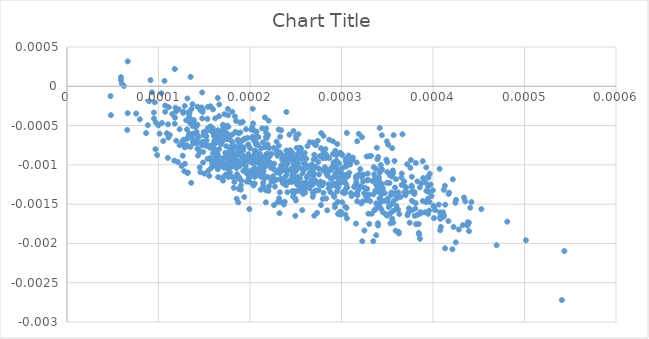
| Category | Series 0 |
|---|---|
| 0.0002059334187757444 | -0.001 |
| 0.00017873950510452084 | -0.001 |
| 0.00038637303945561073 | -0.002 |
| 0.00022622890162013421 | -0.001 |
| 0.0002802560820361803 | -0.001 |
| 0.000198221731616687 | -0.001 |
| 0.0001949640746769581 | -0.001 |
| 0.0003286916102136511 | -0.001 |
| 0.0002985173471838856 | -0.001 |
| 0.0002181282982446233 | -0.001 |
| 0.00018853605518445236 | -0.001 |
| 0.00013614094571099528 | 0 |
| 0.00037973577228441553 | -0.001 |
| 0.00021832474555342267 | -0.001 |
| 0.00021808519748877893 | -0.001 |
| 0.00011782064754439687 | 0 |
| 0.00023542629021997263 | -0.001 |
| 0.00025458799556315825 | -0.001 |
| 9.667395384877579e-05 | -0.001 |
| 0.00031384824350687247 | -0.001 |
| 0.00022511652023571467 | -0.001 |
| 0.00014784454089484923 | -0.001 |
| 0.00029160960077997576 | -0.001 |
| 0.0003720149775167321 | -0.002 |
| 0.00017050756453361517 | 0 |
| 0.00014197136867453284 | -0.001 |
| 0.00016473269119548283 | -0.001 |
| 0.0001052305302103412 | -0.001 |
| 0.0002165882952276627 | -0.001 |
| 0.0002480288001324983 | -0.001 |
| 0.0002398601924504976 | -0.001 |
| 0.00038100035432189695 | -0.001 |
| 0.00013170922230633006 | -0.001 |
| 0.0002932567793928267 | -0.001 |
| 0.00020011428085183844 | -0.001 |
| 0.0002955400213553198 | -0.001 |
| 0.0002504448273408483 | -0.001 |
| 0.00027100320498427675 | -0.001 |
| 0.00039118160850282305 | -0.002 |
| 0.00023614666263451308 | -0.001 |
| 0.00020298063540408244 | 0 |
| 0.00018625745836235854 | -0.001 |
| 0.00035334749468956845 | -0.001 |
| 0.0003928138116213717 | -0.001 |
| 0.00035616765817089664 | -0.001 |
| 9.854872788621157e-05 | -0.001 |
| 0.0002964021250078825 | -0.001 |
| 0.0001477752714875678 | 0 |
| 0.00018586541294297122 | -0.001 |
| 0.0002447611121179773 | -0.001 |
| 0.00022516565482999659 | -0.001 |
| 0.0002588774201122195 | -0.001 |
| 0.00014253200676217967 | 0 |
| 0.00029508170008718006 | -0.001 |
| 0.00021750039707035742 | -0.001 |
| 0.00018360339577949166 | 0 |
| 0.00027202451017920633 | -0.001 |
| 0.00029301994513887444 | -0.002 |
| 0.00018896731118193087 | -0.001 |
| 0.00039189237850564655 | -0.001 |
| 0.0004078451833932507 | -0.002 |
| 0.00035003082546638045 | -0.001 |
| 0.00037687706338994376 | -0.001 |
| 0.00025003936996281664 | -0.001 |
| 0.00019728793817289057 | -0.001 |
| 0.0003352799090532118 | -0.001 |
| 0.0003250335888972819 | -0.002 |
| 0.00030410678075982296 | -0.001 |
| 0.00030445416758229527 | -0.001 |
| 0.00019575285352221847 | -0.001 |
| 0.00025705497244608784 | -0.002 |
| 0.0002899611489096534 | -0.001 |
| 0.00030698811108736225 | -0.001 |
| 0.00014159483662930873 | -0.001 |
| 0.00041126661857923154 | -0.002 |
| 0.000317150060955305 | -0.001 |
| 0.00012531447346106618 | -0.001 |
| 0.00024626842266694334 | -0.001 |
| 0.0002262204638564449 | -0.002 |
| 0.00032738729283113597 | -0.001 |
| 0.00031685818463767597 | -0.001 |
| 0.00018379707366638105 | -0.001 |
| 0.0003769580965676348 | -0.001 |
| 0.00031116378342804964 | -0.001 |
| 0.00013434997356962598 | 0 |
| 0.00016206729997483016 | -0.001 |
| 0.00013720061210421093 | -0.001 |
| 0.00019959738907936468 | -0.001 |
| 0.0003055164096542755 | -0.001 |
| 0.00018077711346175916 | -0.001 |
| 9.12225421565938e-05 | 0 |
| 0.0003565712467995928 | -0.002 |
| 0.00010656436019252807 | 0 |
| 0.0001438061825429067 | -0.001 |
| 0.0002488023057381025 | -0.001 |
| 0.00034183694202578543 | -0.002 |
| 0.00032052779919801926 | -0.001 |
| 0.00014573374174117813 | 0 |
| 0.0001539572967040146 | 0 |
| 0.0002993977793434067 | -0.001 |
| 0.0004080857986583867 | -0.002 |
| 0.00015723460186540427 | -0.001 |
| 0.0001944137675440507 | -0.001 |
| 0.0004110858637544418 | -0.002 |
| 0.0002628354765383007 | -0.001 |
| 0.00013764444905886537 | -0.001 |
| 0.0001277177323899747 | -0.001 |
| 0.0001973731795885422 | -0.001 |
| 0.00019525742949476167 | -0.001 |
| 0.00016209429239599722 | -0.001 |
| 0.0001702779150867903 | -0.001 |
| 0.00015788838617133391 | -0.001 |
| 0.00035006042424402155 | -0.001 |
| 0.0003283878369461841 | -0.001 |
| 0.0002196756268489604 | -0.001 |
| 0.0002161675281232373 | -0.001 |
| 0.0002490070563174264 | -0.001 |
| 0.0002927451366431061 | -0.002 |
| 0.00020573414726800064 | -0.001 |
| 0.0002562448334186213 | -0.001 |
| 0.00023457114473215737 | -0.001 |
| 0.0003421896891339329 | -0.001 |
| 0.0001104036000247431 | 0 |
| 0.00034085490874188917 | -0.001 |
| 0.00033865084178713036 | -0.001 |
| 0.00017959287247124937 | -0.001 |
| 0.00013029049440634234 | 0 |
| 0.00017291520682810065 | -0.001 |
| 0.00020064021581378037 | -0.001 |
| 0.00032239338043904515 | -0.001 |
| 0.00026282518013435595 | -0.001 |
| 0.00012822341076765552 | -0.001 |
| 0.00037447238900880183 | -0.002 |
| 7.95808684689498e-05 | 0 |
| 0.00021083064823730732 | -0.001 |
| 0.00016163102296857786 | -0.001 |
| 0.0004212168902496417 | -0.002 |
| 0.00023699598989939378 | -0.002 |
| 0.0002465270852033079 | -0.001 |
| 0.00021921923179814276 | -0.001 |
| 0.00016619769503775997 | 0 |
| 0.0003857692883986108 | -0.002 |
| 0.0003960319302624654 | -0.001 |
| 0.00028237463044297376 | -0.001 |
| 0.0001764432002426349 | -0.001 |
| 0.0002676932468578302 | -0.001 |
| 0.00043388662975334786 | -0.001 |
| 8.835502415382132e-05 | 0 |
| 0.00042163387778077177 | -0.001 |
| 0.00020988013854728868 | -0.001 |
| 0.00017594631164653184 | 0 |
| 0.00018702836396722016 | -0.001 |
| 0.0002602897504425476 | -0.001 |
| 0.00017483889312105202 | -0.001 |
| 0.0002866045009942038 | -0.001 |
| 0.0002048365183633221 | -0.001 |
| 0.0002432744025494865 | -0.001 |
| 0.00021333682012707387 | -0.001 |
| 0.00016183759028829718 | -0.001 |
| 0.00023657938504991833 | -0.001 |
| 0.00031716699876681466 | -0.001 |
| 0.00036045924244603367 | -0.001 |
| 0.0001763071432001972 | -0.001 |
| 0.0001853053949539179 | -0.001 |
| 0.00017745093051785743 | -0.001 |
| 0.0002340382338156067 | -0.001 |
| 0.00020798679024079455 | -0.001 |
| 0.0003013233984798395 | -0.001 |
| 0.00038300332264009404 | -0.002 |
| 0.0004325575324518978 | -0.002 |
| 0.0002035833179495397 | -0.001 |
| 0.0002695188687702945 | -0.001 |
| 0.00021206966325233723 | -0.001 |
| 0.00015627017857957842 | -0.001 |
| 0.00018986066159581709 | -0.001 |
| 0.00016284953586751734 | -0.001 |
| 0.0003626088800855458 | -0.002 |
| 0.00016064070212063806 | -0.001 |
| 0.00015017301867205257 | -0.001 |
| 0.00017204266140064865 | 0 |
| 0.0002152799617596349 | -0.001 |
| 0.00013570218766838482 | -0.001 |
| 0.00020288445686112927 | -0.001 |
| 5.897914129068165e-05 | 0 |
| 0.0003218320894632418 | -0.001 |
| 0.00039740300366098303 | -0.001 |
| 0.00017536949909190364 | -0.001 |
| 0.0001882747966327844 | -0.001 |
| 0.0003419467291207288 | -0.001 |
| 0.0001311643552702634 | -0.001 |
| 0.0003891614795161946 | -0.001 |
| 0.0003018774786053796 | -0.001 |
| 0.0003042625982225313 | -0.002 |
| 0.00017274023756284814 | -0.001 |
| 9.50150099502424e-05 | 0 |
| 0.00011501485247801883 | 0 |
| 0.00017970668994710576 | -0.001 |
| 0.00023975598275835245 | -0.001 |
| 0.00019468093911309282 | -0.001 |
| 0.0003531945617592981 | -0.002 |
| 0.0002680268743753072 | -0.001 |
| 0.0001779976214839987 | -0.001 |
| 0.00013710976091886555 | 0 |
| 0.00021545505991073905 | -0.001 |
| 0.00037970611064240415 | -0.001 |
| 0.0001756111404882785 | -0.001 |
| 0.00023888401805241468 | -0.001 |
| 0.0002749683122290861 | -0.001 |
| 0.00022929476938840713 | -0.001 |
| 0.00025099698937137814 | -0.001 |
| 0.00022717179863214753 | -0.001 |
| 0.00028030088380057156 | -0.001 |
| 0.0002764379907738762 | -0.001 |
| 0.0002225641652707791 | -0.001 |
| 0.0002759598531931826 | -0.001 |
| 0.00019366758368140411 | -0.001 |
| 0.00026982528812176626 | -0.001 |
| 0.0001185980891678568 | 0 |
| 0.00018474555466352889 | 0 |
| 0.00030507404904854725 | -0.001 |
| 0.00029283634393560996 | -0.001 |
| 0.00035103920795932916 | -0.001 |
| 0.00033051985878899487 | -0.001 |
| 4.798384193669822e-05 | 0 |
| 0.0002624645361696999 | -0.001 |
| 0.00020008885033963777 | -0.001 |
| 0.000211459521846613 | -0.001 |
| 0.0001380701454933932 | -0.001 |
| 0.00015235266167959067 | -0.001 |
| 0.0002844309813395072 | -0.002 |
| 0.000209912697604117 | -0.001 |
| 7.562512097535646e-05 | 0 |
| 0.00015547186049022399 | -0.001 |
| 0.00018098207404340205 | -0.001 |
| 0.0002145318500237185 | -0.001 |
| 0.00017821808242768464 | -0.001 |
| 0.0003084946825064507 | -0.001 |
| 0.00033947999769291473 | -0.002 |
| 0.00024801747940490754 | -0.001 |
| 0.00010318797642310424 | 0 |
| 0.00024065367702583434 | -0.001 |
| 0.00036911231786458746 | -0.001 |
| 0.0003540542018406047 | -0.002 |
| 0.00021909361836585942 | -0.001 |
| 0.00016496299941497937 | -0.001 |
| 0.00036849209852213104 | -0.001 |
| 0.0003274955087172689 | -0.001 |
| 0.0001700014599901151 | -0.001 |
| 0.0002688799464793124 | -0.001 |
| 0.0002182134369824172 | -0.001 |
| 0.00029069586278324675 | -0.001 |
| 0.0003039525753232246 | -0.001 |
| 0.0002496161504964343 | -0.002 |
| 0.00037302861074859755 | -0.002 |
| 0.000148305167465495 | 0 |
| 0.0003164153390549788 | -0.001 |
| 0.00024941897498093144 | -0.001 |
| 0.0003256071452929569 | -0.001 |
| 0.0001420965027023635 | -0.001 |
| 0.00035351614967132097 | -0.002 |
| 0.0002500296068957464 | -0.001 |
| 0.0001614644720669737 | -0.001 |
| 0.0002066990065393385 | -0.001 |
| 0.00038125419602340707 | -0.001 |
| 0.0003700210420013383 | -0.001 |
| 0.00022605152254929302 | -0.001 |
| 0.00030851817762541836 | -0.001 |
| 0.0001764396208613964 | -0.001 |
| 0.0003595117432828328 | -0.001 |
| 0.00037680274141743035 | -0.002 |
| 9.981194105409016e-05 | 0 |
| 0.00025047381764876393 | -0.001 |
| 0.00029399496651311965 | -0.001 |
| 0.0003770352337698551 | -0.001 |
| 0.00014085591514857157 | 0 |
| 0.00011912293702101578 | 0 |
| 0.0001776734208017869 | -0.001 |
| 0.00018735577324138634 | -0.001 |
| 0.00021440681325927448 | -0.001 |
| 0.00013344354120882972 | -0.001 |
| 0.00014878055687302704 | -0.001 |
| 0.0003814519296522681 | -0.002 |
| 0.00019213551304740758 | 0 |
| 0.0001953627921881037 | -0.001 |
| 0.0002052398196329942 | -0.001 |
| 0.00019812787831397023 | -0.001 |
| 0.00025239992967458823 | -0.001 |
| 6.634822644835151e-05 | 0 |
| 9.28714476257924e-05 | 0 |
| 0.00018298259138980918 | -0.001 |
| 0.00014286838451264694 | -0.001 |
| 0.0002313294066219745 | -0.001 |
| 0.00030561411057514567 | -0.001 |
| 0.00029440788577129556 | -0.001 |
| 0.00017619829389659667 | -0.001 |
| 0.0002350625059679038 | -0.001 |
| 0.0003375111538354614 | -0.001 |
| 0.00028330822871475646 | -0.001 |
| 0.00010114387958984501 | -0.001 |
| 0.00012703586406912062 | 0 |
| 0.00017688240231689768 | -0.001 |
| 0.0003602928353597327 | -0.001 |
| 0.00039649335126066166 | -0.001 |
| 0.00039415156930792044 | -0.001 |
| 0.00021228673252972978 | -0.001 |
| 8.640969350197424e-05 | -0.001 |
| 0.00046954451352083004 | -0.002 |
| 0.00023221405868277008 | -0.002 |
| 0.00016479283128653603 | 0 |
| 0.0001719535513482152 | -0.001 |
| 0.000269588963370999 | -0.001 |
| 0.00036866355457179824 | -0.001 |
| 0.00028502308310875883 | -0.001 |
| 0.0002913215034107022 | -0.001 |
| 0.00017541926608520244 | -0.001 |
| 0.0002984071364537323 | -0.001 |
| 0.0003330904530188893 | -0.002 |
| 0.00020513068978654224 | -0.001 |
| 0.000305931520430562 | -0.002 |
| 0.00017191618779799876 | -0.001 |
| 0.0002173344532552119 | -0.001 |
| 0.0002540309029708863 | -0.001 |
| 0.0003209959682896322 | -0.001 |
| 0.0003158778723862503 | -0.002 |
| 0.0003495214622578341 | -0.001 |
| 0.00030457386166453306 | -0.001 |
| 0.0002885134698374821 | -0.001 |
| 0.0005434962031715589 | -0.002 |
| 0.00016289395943441237 | -0.001 |
| 0.0003753020935024595 | -0.001 |
| 0.0004129868821425468 | -0.001 |
| 0.00035851002753189493 | -0.001 |
| 0.0004133668510624672 | -0.002 |
| 0.00018056715577490054 | -0.001 |
| 0.00011719757300663672 | -0.001 |
| 0.00024106470974664208 | -0.001 |
| 0.00025984211643668677 | -0.001 |
| 0.0003313232339991019 | -0.001 |
| 0.00020260450194072913 | -0.001 |
| 0.00013174978194716385 | -0.001 |
| 0.00031626898969890484 | -0.001 |
| 0.00026864950302234533 | -0.001 |
| 0.0003864689300427321 | -0.002 |
| 0.000437932241603477 | -0.002 |
| 0.00022334797143114672 | -0.001 |
| 0.0003843744022916472 | -0.002 |
| 0.00019568934470348882 | -0.001 |
| 0.00033954525101226665 | -0.002 |
| 0.00037999338856151675 | -0.002 |
| 0.0002503681407372953 | -0.001 |
| 0.00027538574013725276 | -0.001 |
| 0.00016695383510397633 | -0.001 |
| 0.0002615574610526167 | -0.001 |
| 0.00023403721931030002 | -0.001 |
| 0.0002092210485152265 | -0.001 |
| 0.00025452925841444726 | -0.001 |
| 0.00019492152314571845 | -0.001 |
| 0.0001344495023569261 | 0 |
| 0.00018056957987733267 | -0.001 |
| 0.00037076890508636913 | -0.001 |
| 0.00029517818331799506 | -0.001 |
| 0.00020216904584731158 | -0.001 |
| 0.0003071094602311043 | -0.001 |
| 0.0002691031310067683 | -0.001 |
| 0.0002818342050536736 | -0.001 |
| 0.00024175825759306882 | -0.001 |
| 0.00024587349926512465 | -0.001 |
| 0.00019065949941468672 | -0.001 |
| 0.0001584439575234271 | -0.001 |
| 0.00023995765376617749 | -0.001 |
| 0.00025710450605687975 | -0.001 |
| 0.00017580993517418323 | 0 |
| 0.0001993443802107656 | -0.001 |
| 0.00017708644564187775 | -0.001 |
| 0.00031111691790617187 | -0.001 |
| 0.0001720073925523847 | -0.001 |
| 0.0001895121046036329 | -0.001 |
| 0.00025155158259768107 | -0.001 |
| 0.00018887981154502886 | -0.001 |
| 0.00018508768869124158 | -0.001 |
| 0.0004012996182561737 | -0.002 |
| 0.0002118176680346929 | -0.001 |
| 0.0004022517853841748 | -0.002 |
| 0.0002859065574455456 | -0.001 |
| 0.00024700541743190215 | -0.001 |
| 0.00014949705733165885 | -0.001 |
| 0.0002037205842758771 | -0.001 |
| 0.00018681985178252864 | -0.001 |
| 0.0003443325115344284 | -0.001 |
| 0.00019236682373256184 | -0.001 |
| 0.00021946099180440647 | -0.001 |
| 0.00027719717932505044 | -0.001 |
| 0.00015598722993055995 | -0.001 |
| 0.0003392109601972101 | -0.001 |
| 0.0002775432791306632 | -0.001 |
| 0.0001992947948080444 | -0.002 |
| 0.00023560948631172246 | -0.001 |
| 0.00018790314937250702 | -0.001 |
| 0.00016112953750644895 | -0.001 |
| 8.960498833706473e-05 | 0 |
| 0.00040772437361154734 | -0.002 |
| 0.00028661203873844843 | -0.001 |
| 0.00020567559464042455 | -0.001 |
| 0.0004010205566426469 | -0.002 |
| 0.000147633613261658 | -0.001 |
| 0.0003165811112805319 | -0.001 |
| 0.00026057613558001325 | -0.001 |
| 0.00025259541968956786 | -0.001 |
| 0.00024998291961160485 | -0.001 |
| 0.00042824194774669514 | -0.002 |
| 6.583686411615749e-05 | -0.001 |
| 0.00018891408739504318 | -0.001 |
| 0.00013393192266488224 | 0 |
| 0.0003359713617023092 | -0.002 |
| 0.00023677367696299504 | -0.001 |
| 0.0002794849103306746 | -0.001 |
| 0.00014496122170764447 | -0.001 |
| 0.0002965721802592531 | -0.001 |
| 0.00023989264797152373 | -0.001 |
| 0.00024229886319365789 | -0.001 |
| 0.00017500441813118834 | -0.001 |
| 0.0003515697350297811 | -0.002 |
| 0.00020323279807177752 | -0.001 |
| 0.0001505711301885452 | -0.001 |
| 0.00043762761471050315 | -0.002 |
| 0.00027750414827464547 | -0.001 |
| 0.00014580548487470944 | -0.001 |
| 0.0002719718281989191 | -0.001 |
| 0.000286757237394326 | -0.001 |
| 0.00036582486280921605 | -0.001 |
| 0.0002966135562341215 | -0.001 |
| 0.0003288044781311578 | -0.001 |
| 0.0002411146117273924 | -0.001 |
| 0.00035822892599511206 | -0.001 |
| 0.00025875453613744345 | -0.001 |
| 0.00030940398170344003 | -0.001 |
| 0.00015676811178064366 | 0 |
| 0.0003432165067243254 | -0.001 |
| 0.0002186735651535173 | -0.001 |
| 0.00033798172390709974 | -0.002 |
| 0.00013714988604839168 | 0 |
| 0.00034819556893537655 | -0.002 |
| 0.00019852697383481975 | -0.001 |
| 0.00021358382749704543 | -0.001 |
| 0.0002584496181939829 | -0.001 |
| 0.00030082509846062226 | -0.001 |
| 0.0002911830573035344 | -0.001 |
| 0.0005015263872846488 | -0.002 |
| 0.0002382983881811299 | -0.001 |
| 0.00040045225870711225 | -0.002 |
| 0.0003947367316661776 | -0.002 |
| 0.00019825887672600054 | -0.001 |
| 0.00013488707247799294 | -0.001 |
| 0.000261785850480353 | -0.001 |
| 0.00016607731020758037 | -0.001 |
| 0.00016442277957102195 | -0.001 |
| 0.00031956565694263875 | -0.001 |
| 0.00014946393003779964 | -0.001 |
| 0.00042494118873663046 | -0.002 |
| 0.00028026377546681446 | -0.001 |
| 0.0001312376149937569 | -0.001 |
| 0.00018127459502225238 | -0.001 |
| 0.0002465033622828351 | -0.001 |
| 0.0002546419310804952 | -0.001 |
| 0.00021620856827817055 | 0 |
| 0.00024800038946250094 | -0.001 |
| 0.0002511961643160142 | -0.001 |
| 0.0002119234004260783 | -0.001 |
| 0.0001667827023343326 | -0.001 |
| 0.0002535806927250428 | -0.001 |
| 0.00016846081000389918 | -0.001 |
| 0.0003542959667561207 | -0.001 |
| 0.00020623108894661155 | -0.001 |
| 0.00016564676742893185 | -0.001 |
| 0.0002192500416860216 | -0.001 |
| 0.00026471682997702414 | -0.001 |
| 0.0002962434433628097 | -0.002 |
| 0.0002597690728074562 | -0.001 |
| 0.00017598540931300282 | -0.001 |
| 9.496725242811544e-05 | 0 |
| 0.00042520418081129366 | -0.001 |
| 0.00019269480405557061 | -0.001 |
| 0.00034692459180840504 | -0.001 |
| 0.0002673983891059872 | -0.001 |
| 0.00021443272300649985 | -0.001 |
| 0.00035253016761256444 | -0.001 |
| 0.0001867173656308286 | -0.001 |
| 0.0003014806016157521 | -0.001 |
| 6.220812260715183e-05 | 0 |
| 0.00021265333791327704 | -0.001 |
| 0.00012612942101853354 | -0.001 |
| 0.00011804382346540235 | 0 |
| 0.00030775725009680435 | -0.001 |
| 0.00020778339550456005 | -0.001 |
| 0.00016060545719121712 | -0.001 |
| 0.00037178996787877737 | -0.001 |
| 0.0003322325584216107 | -0.001 |
| 0.00015967955350303033 | -0.001 |
| 0.0002456942058159513 | -0.001 |
| 0.0003396106744810735 | -0.001 |
| 0.00013867069035525183 | 0 |
| 0.00038066540428956263 | -0.002 |
| 0.0001806951869554741 | 0 |
| 0.0002060679489144018 | -0.001 |
| 0.00029502688718253197 | -0.001 |
| 0.000343667868532106 | -0.002 |
| 0.00014785173091090567 | -0.001 |
| 0.00024712274137321126 | -0.001 |
| 0.00017702318756773595 | -0.001 |
| 0.00017036290664281174 | -0.001 |
| 0.00017465886678290116 | -0.001 |
| 0.0001682779465464166 | -0.001 |
| 0.0002649335749075488 | -0.001 |
| 0.00026209754389047463 | -0.001 |
| 0.00024961239534399514 | -0.001 |
| 0.0002916484613207166 | -0.001 |
| 0.00011125796672961642 | 0 |
| 0.00023918789706509042 | -0.001 |
| 0.0002260192673763142 | -0.001 |
| 0.00013356851349735947 | 0 |
| 0.00017496083824228628 | -0.001 |
| 0.00032480709555237166 | -0.001 |
| 0.00033978321741467526 | -0.002 |
| 0.00020651690908517835 | -0.001 |
| 0.0002396961672664784 | 0 |
| 0.00030457682544812227 | -0.001 |
| 0.0002458449448773121 | -0.001 |
| 0.0003666249757630619 | -0.001 |
| 0.00016637157821688565 | 0 |
| 0.00020377881269333575 | -0.001 |
| 0.00017325519826124472 | -0.001 |
| 0.0003949641939871978 | -0.001 |
| 0.00017793314050959383 | -0.001 |
| 0.0002702216309098374 | -0.001 |
| 0.0001840314086084606 | -0.001 |
| 5.892029850760835e-05 | 0 |
| 0.0003358413153011293 | -0.001 |
| 0.00016889790344419607 | -0.001 |
| 0.0002001519672347053 | -0.001 |
| 0.00016616167783231088 | -0.001 |
| 0.00018123714480144376 | -0.001 |
| 5.9991419776257756e-05 | 0 |
| 0.00029921325159835255 | -0.001 |
| 0.00041322114711174647 | -0.002 |
| 0.00010729817081599305 | 0 |
| 0.00019771085804186036 | -0.001 |
| 0.00017357552699150055 | -0.001 |
| 0.00016833774477548674 | -0.001 |
| 0.0002686159113229505 | -0.001 |
| 0.0004118420496526501 | -0.001 |
| 0.00018124196246842232 | -0.001 |
| 0.00016972356264361913 | -0.001 |
| 0.00028035663827817326 | -0.001 |
| 0.0002988512980478962 | -0.001 |
| 0.0002336257350850634 | -0.001 |
| 0.00021511804432625906 | -0.001 |
| 0.0001743559146888583 | -0.001 |
| 0.00040862101464428363 | -0.002 |
| 0.00022603786634622382 | -0.001 |
| 0.00022016515099163212 | -0.001 |
| 0.00018669487351317948 | -0.001 |
| 0.00016371555186708533 | -0.001 |
| 0.00018443530824128394 | -0.001 |
| 0.0003888479251271131 | -0.001 |
| 0.00038877961196626316 | -0.001 |
| 0.0003497975944892151 | -0.002 |
| 0.000191744439028223 | -0.001 |
| 0.00025283027124766214 | -0.001 |
| 0.00018673377691218323 | -0.001 |
| 0.0001407851405156623 | -0.001 |
| 0.00048112694084556114 | -0.002 |
| 0.0003294297942412406 | -0.002 |
| 0.0002953581712065781 | -0.001 |
| 0.00025333433944057685 | -0.001 |
| 0.00022636040875576605 | -0.001 |
| 0.00012308493662179467 | -0.001 |
| 0.00017121820833520813 | -0.001 |
| 0.00022387003787283793 | -0.001 |
| 0.0002326490979650969 | -0.001 |
| 0.00030584075375818015 | -0.001 |
| 0.00021745040159462003 | -0.001 |
| 0.00031585081611643404 | -0.001 |
| 0.00024184344919952233 | -0.001 |
| 0.00022046552033512236 | 0 |
| 0.0003217147542173933 | -0.001 |
| 0.00037364248996330315 | -0.002 |
| 0.00045287779527698106 | -0.002 |
| 0.00030087195208268583 | -0.001 |
| 0.00035067102501792343 | -0.001 |
| 0.0002484279590354696 | -0.001 |
| 0.00016840203100488475 | -0.001 |
| 0.00033022365370174425 | -0.001 |
| 0.000441970872619412 | -0.001 |
| 0.0003157072099184719 | -0.001 |
| 0.0002115096327754595 | -0.001 |
| 0.00020379056215129432 | -0.001 |
| 0.00018036259852343073 | -0.001 |
| 0.00033785264771933946 | -0.001 |
| 0.00033741664719803073 | -0.001 |
| 0.0001706642251339255 | -0.001 |
| 0.00020213517511630206 | -0.001 |
| 0.00031033531666373193 | -0.001 |
| 0.000384481059284554 | -0.002 |
| 0.0003125112050276923 | -0.001 |
| 0.00034292076209532156 | -0.001 |
| 0.00017241349570859654 | -0.001 |
| 0.00018758786135250526 | -0.001 |
| 0.00029427614315284613 | -0.001 |
| 0.00030344439310040487 | -0.001 |
| 0.00025613203247453376 | -0.001 |
| 4.759741515009914e-05 | 0 |
| 0.0002777878845499275 | -0.001 |
| 0.00013570207385211653 | -0.001 |
| 0.00024653536428435885 | -0.001 |
| 0.00030310518573546186 | -0.001 |
| 0.00018479193566439445 | -0.001 |
| 0.00016100117882748735 | -0.001 |
| 0.00027454961317752364 | -0.001 |
| 0.0003560714282286182 | -0.002 |
| 0.00033477063012451953 | -0.002 |
| 0.0003015711616731956 | -0.001 |
| 0.00020506800835302875 | -0.001 |
| 0.0004168276566775981 | -0.002 |
| 0.00035652030325694916 | -0.001 |
| 0.000211164494096381 | -0.001 |
| 0.00011024939039465324 | -0.001 |
| 0.00026367758680204356 | -0.001 |
| 0.00021733451146828276 | -0.001 |
| 0.00024479431067299373 | -0.001 |
| 0.00034003326883698534 | -0.001 |
| 0.00020247742897964118 | -0.001 |
| 0.00023862323514865856 | -0.001 |
| 0.0002188015562437123 | -0.001 |
| 0.0001837698424041949 | -0.001 |
| 0.0002181039065275325 | -0.001 |
| 0.00034357588934087985 | -0.001 |
| 0.00039988764648051954 | -0.001 |
| 0.000139994973875426 | -0.001 |
| 0.00018667516098503295 | -0.001 |
| 0.0002685010191149651 | -0.001 |
| 0.00023179431185321554 | -0.001 |
| 0.00035692632888988264 | -0.001 |
| 0.0002907932280215616 | -0.001 |
| 0.00016519593460508834 | -0.001 |
| 0.0003654034119927224 | -0.001 |
| 0.0002879463860330867 | -0.001 |
| 0.00016624675130071554 | -0.001 |
| 0.00013208724965497228 | -0.001 |
| 0.00022923766026275197 | -0.001 |
| 0.0002000554152054493 | -0.001 |
| 0.0001481696581379594 | 0 |
| 0.00023996966119995626 | -0.001 |
| 0.00019260066085559932 | -0.001 |
| 0.00012869137439176542 | 0 |
| 0.00013121541169995932 | -0.001 |
| 0.00025294004355992 | -0.001 |
| 0.00020737323477347793 | -0.001 |
| 0.0003006444454094031 | -0.001 |
| 0.00015981624988757308 | -0.001 |
| 0.00017076089767266303 | -0.001 |
| 0.0001288306669306034 | -0.001 |
| 0.0001907309165119341 | -0.001 |
| 0.00017829008729475788 | -0.001 |
| 0.0002105777548290006 | -0.001 |
| 0.00015962963209592129 | 0 |
| 0.00032901546193336807 | -0.001 |
| 0.00017828998240388043 | -0.001 |
| 0.0002721649717710511 | -0.001 |
| 0.00012305046474552598 | -0.001 |
| 0.00023381197689860222 | -0.001 |
| 0.00018861492491730765 | -0.001 |
| 0.00022880357520932063 | -0.001 |
| 0.0001469956989829571 | 0 |
| 0.0001592259011636727 | -0.001 |
| 0.00023975235544099871 | -0.001 |
| 0.00026723192396437803 | -0.001 |
| 0.00015370322772690527 | -0.001 |
| 0.00032668709890126227 | -0.001 |
| 0.0003241014606361725 | -0.001 |
| 0.00015368998520290346 | -0.001 |
| 0.0002814063503840331 | -0.001 |
| 0.00040764278586864826 | -0.002 |
| 0.00031714750529803154 | -0.001 |
| 0.00015342109341516871 | 0 |
| 0.00012699012786680826 | 0 |
| 0.00034323981860489406 | -0.001 |
| 0.00022211200662000037 | -0.001 |
| 0.0002045515926613889 | -0.001 |
| 0.00017058638387380026 | -0.001 |
| 0.00025019066462118617 | -0.001 |
| 0.00042451289829016593 | -0.001 |
| 0.00020527892902500605 | -0.001 |
| 0.0003599812565223999 | -0.002 |
| 0.00021773613536403704 | -0.001 |
| 0.00018774267499449573 | -0.001 |
| 0.00015928319903313573 | -0.001 |
| 0.0002623265874559922 | -0.001 |
| 0.000271314698069426 | -0.001 |
| 0.0002467116926459403 | -0.001 |
| 0.0002846395112648944 | -0.001 |
| 0.0002172063557609007 | -0.001 |
| 0.00016815349891235608 | -0.001 |
| 0.0001325563765573962 | 0 |
| 0.000240944737934312 | -0.001 |
| 0.0004062954737730745 | -0.002 |
| 0.0002521691569188352 | -0.001 |
| 0.00025461930877482936 | -0.001 |
| 0.0002662113132509381 | -0.001 |
| 0.00015960570885161982 | -0.001 |
| 0.00012871536113699805 | -0.001 |
| 0.00021942254867051824 | -0.001 |
| 0.00021417427570301394 | -0.001 |
| 0.00015872720614170993 | -0.001 |
| 0.00023939334310196247 | -0.001 |
| 0.0002989316655578153 | -0.002 |
| 0.0002378257669439973 | -0.001 |
| 0.00011231532865911602 | -0.001 |
| 0.00019283234972125425 | -0.001 |
| 0.0003222661228171852 | -0.001 |
| 0.00033702844758793347 | -0.001 |
| 0.00023924032722545885 | -0.001 |
| 9.600030115355919e-05 | 0 |
| 0.0003303394582555602 | -0.002 |
| 0.0003497424036445562 | -0.001 |
| 0.000339836615798069 | -0.001 |
| 0.0003286653831475088 | -0.001 |
| 0.00013137705015741664 | -0.001 |
| 0.0002379197415046258 | -0.001 |
| 9.69401221855061e-05 | 0 |
| 0.00035446703312096465 | -0.001 |
| 0.00014875982892442022 | -0.001 |
| 0.00024768622090530414 | -0.001 |
| 0.00019230503057280062 | -0.001 |
| 0.00011773817128319489 | 0 |
| 0.00034075967875022545 | -0.001 |
| 0.00010730317170563471 | 0 |
| 0.00013307859855523642 | -0.001 |
| 0.00018140339959810437 | -0.001 |
| 0.0003229593588587707 | -0.001 |
| 0.00032804725137485966 | -0.001 |
| 0.00023902704337496015 | -0.001 |
| 0.00014311380787555172 | -0.001 |
| 0.0003441508419888703 | -0.001 |
| 0.00036249674228465585 | -0.002 |
| 0.0004170941387130496 | -0.001 |
| 0.00019674684679671812 | -0.001 |
| 0.00023190847027107392 | -0.001 |
| 0.0002475421420098503 | -0.001 |
| 0.00039463931593779043 | -0.001 |
| 0.00022553020817020128 | -0.001 |
| 0.0003490816530435538 | -0.001 |
| 0.0001940402755744044 | -0.001 |
| 0.00027544369609326533 | -0.001 |
| 0.0003951496986297859 | -0.001 |
| 0.00015142898991147614 | -0.001 |
| 0.00038559085603863614 | -0.001 |
| 0.0001853975342637489 | -0.001 |
| 0.00018102953025709532 | -0.001 |
| 0.00038732804175818257 | -0.001 |
| 0.0002076998174876862 | -0.001 |
| 0.00028558183922010707 | -0.001 |
| 0.0003399727436166619 | -0.002 |
| 0.0002733088553169116 | -0.002 |
| 0.0003631879364552028 | -0.002 |
| 0.00034517380828119013 | -0.002 |
| 0.0002301392403928431 | -0.001 |
| 0.00031588903441207976 | -0.001 |
| 0.0002334988117278488 | -0.001 |
| 0.00025801090817707855 | -0.001 |
| 0.0002502239024046379 | -0.001 |
| 0.00036572379384474513 | -0.001 |
| 0.0003553845652948688 | -0.001 |
| 0.00012122813661160861 | -0.001 |
| 0.0002694173368796704 | -0.001 |
| 0.00013767653909319165 | -0.001 |
| 0.00015256555602911111 | -0.001 |
| 0.00019001738983802672 | -0.001 |
| 0.00028333516527594767 | -0.001 |
| 0.00035919194703579963 | -0.002 |
| 0.00018383619328643112 | -0.001 |
| 0.00035173820916381283 | -0.001 |
| 0.00015372348007349697 | -0.001 |
| 0.00035305676009812916 | -0.001 |
| 0.00014264957235469915 | 0 |
| 0.0001619831837196904 | 0 |
| 0.00016485518268649182 | -0.001 |
| 0.000252248908215973 | -0.001 |
| 0.00025867911825095167 | -0.001 |
| 0.0001377400102401269 | -0.001 |
| 0.00034464539751444414 | -0.001 |
| 0.00020742305917460275 | -0.001 |
| 0.00029794662340532736 | -0.002 |
| 0.00017206187970659345 | -0.001 |
| 0.00034412092506919226 | -0.001 |
| 0.0002300588063575742 | -0.001 |
| 0.00035970112560184677 | -0.002 |
| 0.00014502622688944303 | -0.001 |
| 0.00022905097057694418 | -0.001 |
| 0.00024397226546813132 | -0.001 |
| 0.00019633694608740988 | -0.001 |
| 0.0002063873923064743 | -0.001 |
| 0.00017797174598635612 | -0.001 |
| 0.00039239918288645433 | -0.001 |
| 0.00017647331279969366 | -0.001 |
| 0.0003645833759951989 | -0.001 |
| 0.00016964673655178213 | -0.001 |
| 0.0004225659157937117 | -0.002 |
| 0.0002213438481602664 | -0.001 |
| 0.00035525247451163796 | -0.002 |
| 0.00020848868165697853 | -0.001 |
| 0.00012203076689814156 | 0 |
| 0.00019331873975858677 | -0.001 |
| 0.00022885447058454384 | -0.001 |
| 0.0002858227321177665 | -0.001 |
| 0.00021143359544200345 | -0.001 |
| 0.00017744215655988483 | -0.001 |
| 0.00022002637281165778 | -0.001 |
| 0.0001862954657902061 | -0.001 |
| 0.0002143731907295619 | -0.001 |
| 0.00018997796691342937 | -0.001 |
| 0.00023555735345647184 | -0.001 |
| 0.000407174098213338 | -0.001 |
| 0.00018102626785228938 | -0.001 |
| 0.00015448597722184313 | -0.001 |
| 0.00031753901059389673 | -0.001 |
| 0.000337147724195061 | -0.002 |
| 0.00025756480969331625 | -0.001 |
| 0.0002209211033392283 | -0.001 |
| 0.00038491399813878215 | -0.002 |
| 0.00011943886383101349 | -0.001 |
| 0.00016516866357754482 | -0.001 |
| 0.00020337488491610825 | 0 |
| 0.0002572596274432193 | -0.001 |
| 0.00044069044475854183 | -0.002 |
| 0.0003236725755823061 | -0.001 |
| 0.0001316228337199764 | 0 |
| 0.00016451747259736644 | -0.001 |
| 0.0002920629496293546 | -0.001 |
| 0.00031890171832125525 | -0.001 |
| 0.0002685241231359317 | -0.001 |
| 0.00014711489247152805 | 0 |
| 0.0001388516893809051 | -0.001 |
| 0.00017396664893530519 | -0.001 |
| 0.00020517968271776505 | -0.001 |
| 0.0003062991294981342 | -0.001 |
| 0.00012645310808459412 | -0.001 |
| 0.000300344976652456 | -0.001 |
| 0.00015763845935562077 | -0.001 |
| 0.0002596130030528607 | -0.001 |
| 0.0003379612689138 | -0.001 |
| 0.000375806688222619 | -0.001 |
| 0.0003958896720796757 | -0.002 |
| 0.0002614869459093015 | -0.001 |
| 0.0003112736655612418 | -0.001 |
| 0.00027888013308730345 | -0.001 |
| 0.0002590622927757958 | -0.001 |
| 0.00022086924743955463 | -0.001 |
| 0.0003618293051614335 | -0.002 |
| 0.00020727255285008585 | -0.001 |
| 0.0001988003129772201 | -0.001 |
| 0.00030545476706927846 | -0.002 |
| 0.0003452054228131018 | -0.001 |
| 0.0002711874085870625 | -0.001 |
| 0.00024889206097747883 | -0.001 |
| 0.00030483642571180766 | -0.001 |
| 0.0001622390004406811 | -0.001 |
| 0.0001871780483417535 | -0.001 |
| 0.00034296835031879836 | -0.001 |
| 0.0002045043056376077 | -0.001 |
| 0.00031820041135842533 | -0.001 |
| 0.00020711214606478518 | -0.001 |
| 0.0003828968625779628 | -0.001 |
| 0.00029668116066939275 | -0.001 |
| 0.00020481234800015955 | -0.001 |
| 0.0003397872855911968 | -0.001 |
| 0.00023503655586051437 | -0.001 |
| 0.0001612237342781958 | -0.001 |
| 0.0003337503006819871 | -0.001 |
| 0.00030436108660693127 | -0.002 |
| 0.00023024470449284432 | -0.001 |
| 0.0002030682504496809 | -0.001 |
| 0.00026893760291031436 | -0.001 |
| 0.00017592067265807923 | -0.001 |
| 0.00034734795332119447 | -0.001 |
| 0.00018327988236386514 | -0.001 |
| 0.0002959738491200292 | -0.001 |
| 0.00039841132680744877 | -0.001 |
| 0.0003568797992884853 | -0.001 |
| 0.00016173027774518187 | -0.001 |
| 0.0003713017274396794 | -0.001 |
| 0.0002231133702707513 | -0.001 |
| 0.00029201848336728913 | -0.001 |
| 0.0001885119921204995 | -0.001 |
| 0.00024550160739139246 | -0.001 |
| 0.00018221109926234514 | -0.001 |
| 0.00022349810842268623 | -0.001 |
| 6.628915088832641e-05 | 0 |
| 0.00013512381970708925 | 0 |
| 0.00025121354556348655 | -0.001 |
| 0.00029727572580820087 | -0.001 |
| 0.0001935714942859966 | -0.001 |
| 0.00027759497075644695 | -0.002 |
| 0.00015627283321909205 | -0.001 |
| 0.0002591802069795002 | -0.001 |
| 0.00030489558180897856 | -0.001 |
| 0.0004393297497446432 | -0.002 |
| 0.00028821484312373496 | -0.001 |
| 0.00020566821122752345 | -0.001 |
| 0.00028011050585912843 | -0.001 |
| 0.0002116189092721362 | -0.001 |
| 0.00012739074360383588 | -0.001 |
| 0.00017311664201620156 | -0.001 |
| 0.0003417536880690815 | -0.001 |
| 0.00027191564789186425 | -0.001 |
| 0.00025422818302168744 | -0.001 |
| 0.00023577516992868408 | -0.001 |
| 0.0004392093985508109 | -0.002 |
| 0.0002464119829698284 | -0.001 |
| 0.00022252999164740144 | -0.001 |
| 0.0001525832199239157 | -0.001 |
| 0.0002326751111783691 | -0.001 |
| 0.0002651642541142007 | -0.001 |
| 0.00025589611857644026 | -0.001 |
| 0.00026742523044196397 | -0.001 |
| 0.0002932367070461769 | -0.001 |
| 0.0002926527916859653 | -0.001 |
| 0.000336465099164623 | -0.001 |
| 0.0001108661222257352 | -0.001 |
| 0.00017546939640079607 | -0.001 |
| 0.0002531927700106633 | -0.001 |
| 0.0003420384753875743 | -0.001 |
| 0.00021142588437113118 | -0.001 |
| 0.00023608124105688584 | -0.001 |
| 0.00020992717647988507 | -0.001 |
| 0.00018904475373774575 | -0.001 |
| 0.00015269262516082034 | -0.001 |
| 0.00039461955532362554 | -0.001 |
| 0.0002740351239270286 | -0.001 |
| 0.00034154938350181593 | -0.001 |
| 0.0002994581018411556 | -0.002 |
| 0.00024310006504360679 | -0.001 |
| 0.0003053461566435411 | -0.001 |
| 0.00028979308157072304 | -0.001 |
| 0.0002115626856143242 | -0.001 |
| 0.00023296353144757473 | -0.001 |
| 0.000540852079079487 | -0.003 |
| 0.0004351842855567944 | -0.001 |
| 0.00020128954583456077 | -0.001 |
| 0.0003433405787492182 | -0.001 |
| 0.00017246473357413858 | -0.001 |
| 0.0002653826779071206 | -0.001 |
| 0.0002702490495321135 | -0.002 |
| 0.00020254853599710313 | -0.001 |
| 0.0001436573494533411 | -0.001 |
| 0.00031174521656042356 | -0.001 |
| 0.00031613862546358944 | -0.001 |
| 0.00021570331096067467 | -0.001 |
| 0.0003227277876279525 | -0.002 |
| 0.0003050600671177333 | -0.001 |
| 0.0002200387477815466 | -0.001 |
| 0.00033487606817884593 | -0.001 |
| 0.00010371703930929575 | 0 |
| 0.0003765910564606766 | -0.001 |
| 0.00036210648990090137 | -0.001 |
| 0.00015003325292030437 | -0.001 |
| 0.0001594303911600885 | -0.001 |
| 0.00022049598124768155 | -0.001 |
| 0.00030176107639001134 | -0.001 |
| 0.000283035668568962 | -0.001 |
| 0.00018375526748378303 | -0.001 |
| 0.0002515001409706752 | -0.001 |
| 0.00015688220318986725 | -0.001 |
| 0.00018918483425222726 | 0 |
| 0.00027964840862720593 | -0.001 |
| 0.0003149739370736431 | -0.001 |
| 0.00026802536308472035 | -0.001 |
| 0.0003579567810680248 | -0.001 |
| 0.0001477501729943113 | 0 |
| 0.00041765466489968977 | -0.001 |
| 0.00014251264182990112 | -0.001 |
| 0.00023148497194756953 | -0.001 |
| 0.000283869684793242 | -0.001 |
| 0.0002621704471406261 | -0.001 |
| 0.00021481957686229173 | -0.001 |
| 0.00017341681447966337 | -0.001 |
| 0.00020600619078708408 | -0.001 |
| 0.00017811292034510483 | -0.001 |
| 0.0001753164873806837 | -0.001 |
| 0.00035515954213070314 | -0.001 |
| 0.0003767276604747529 | -0.001 |
| 0.00029466603244683473 | -0.001 |
| 0.00017067975037525035 | -0.001 |
| 0.0003442301171338219 | -0.001 |
| 0.00041207765455343576 | -0.002 |
| 0.00023241291275166156 | -0.001 |
| 0.00024769301130607007 | -0.001 |
| 0.00010904077645616984 | -0.001 |
| 0.00034349955366939753 | -0.001 |
| 0.00039264643074554803 | -0.001 |
| 0.00033957655296011776 | -0.001 |